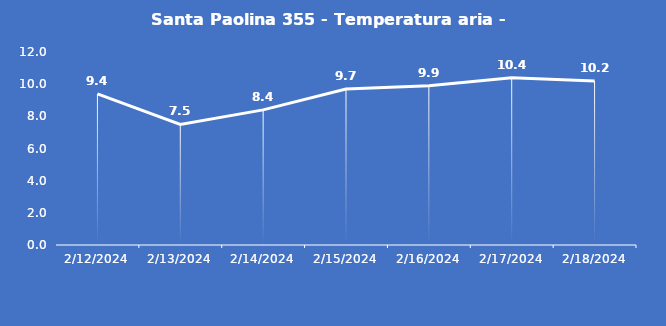
| Category | Santa Paolina 355 - Temperatura aria - Grezzo (°C) |
|---|---|
| 2/12/24 | 9.4 |
| 2/13/24 | 7.5 |
| 2/14/24 | 8.4 |
| 2/15/24 | 9.7 |
| 2/16/24 | 9.9 |
| 2/17/24 | 10.4 |
| 2/18/24 | 10.2 |